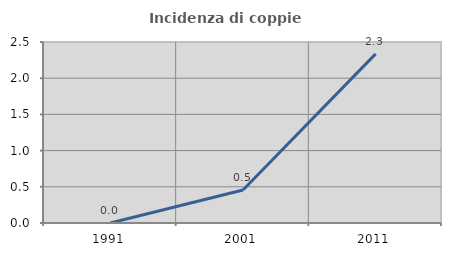
| Category | Incidenza di coppie miste |
|---|---|
| 1991.0 | 0 |
| 2001.0 | 0.456 |
| 2011.0 | 2.336 |